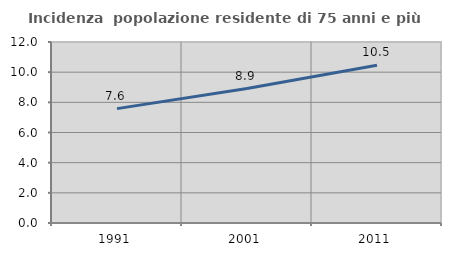
| Category | Incidenza  popolazione residente di 75 anni e più |
|---|---|
| 1991.0 | 7.582 |
| 2001.0 | 8.915 |
| 2011.0 | 10.452 |